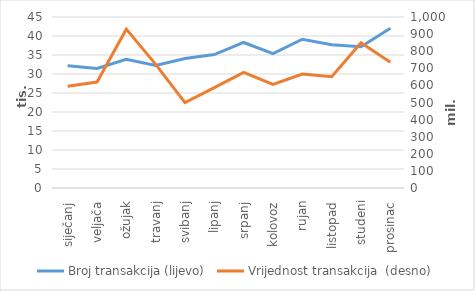
| Category | Broj transakcija (lijevo) |
|---|---|
| siječanj | 32151 |
| veljača | 31443 |
| ožujak | 33843 |
| travanj | 32240 |
| svibanj | 34089 |
| lipanj | 35124 |
| srpanj | 38294 |
| kolovoz | 35362 |
| rujan | 39151 |
| listopad | 37706 |
| studeni | 37180 |
| prosinac | 42037 |